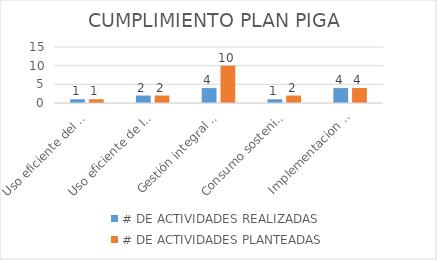
| Category | # DE ACTIVIDADES REALIZADAS | # DE ACTIVIDADES PLANTEADAS |
|---|---|---|
| Uso eficiente del agua. | 1 | 1 |
| Uso eficiente de la energía | 2 | 2 |
| Gestión integral de los resiudos | 4 | 10 |
| Consumo sostenible | 1 | 2 |
| Implementacion de practicas sostenibles | 4 | 4 |